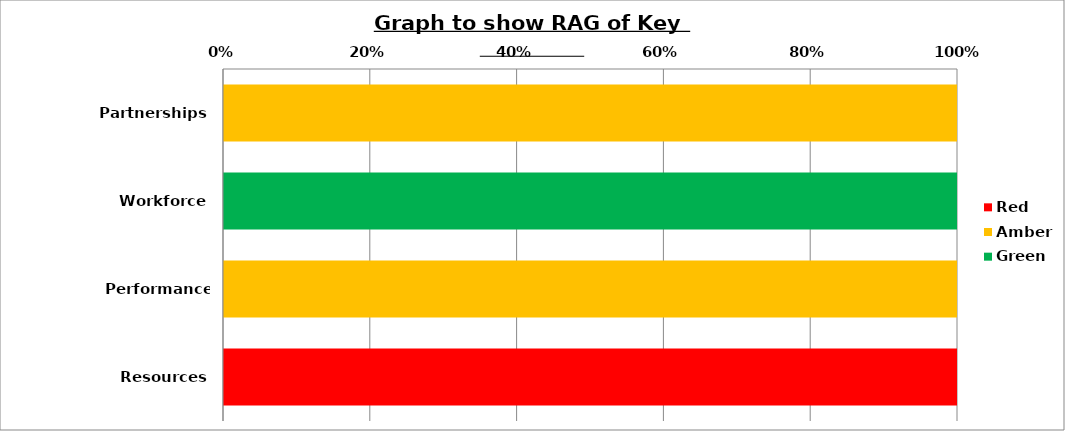
| Category | Red | Amber | Green |
|---|---|---|---|
| Partnerships | 0 | 100 | 0 |
| Workforce | 0 | 0 | 100 |
| Performance Management | 0 | 100 | 0 |
| Resources | 100 | 0 | 0 |